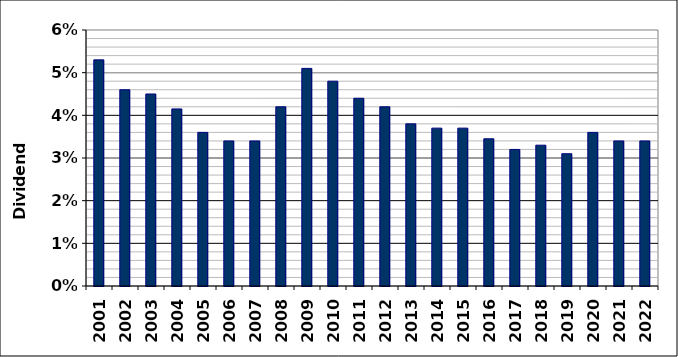
| Category | Series 0 |
|---|---|
| 2001.0 | 0.053 |
| 2002.0 | 0.046 |
| 2003.0 | 0.045 |
| 2004.0 | 0.042 |
| 2005.0 | 0.036 |
| 2006.0 | 0.034 |
| 2007.0 | 0.034 |
| 2008.0 | 0.042 |
| 2009.0 | 0.051 |
| 2010.0 | 0.048 |
| 2011.0 | 0.044 |
| 2012.0 | 0.042 |
| 2013.0 | 0.038 |
| 2014.0 | 0.037 |
| 2015.0 | 0.037 |
| 2016.0 | 0.034 |
| 2017.0 | 0.032 |
| 2018.0 | 0.033 |
| 2019.0 | 0.031 |
| 2020.0 | 0.036 |
| 2021.0 | 0.034 |
| 2022.0 | 0.034 |